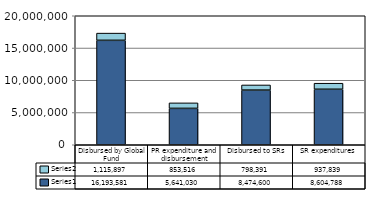
| Category | Series 0 | Series 1 |
|---|---|---|
| Disbursed by Global Fund | 16193581.27 | 1115896.53 |
| PR expenditure and disbursement | 5641030.473 | 853515.537 |
| Disbursed to SRs | 8474599.692 | 798390.611 |
| SR expenditures | 8604788.461 | 937839.372 |